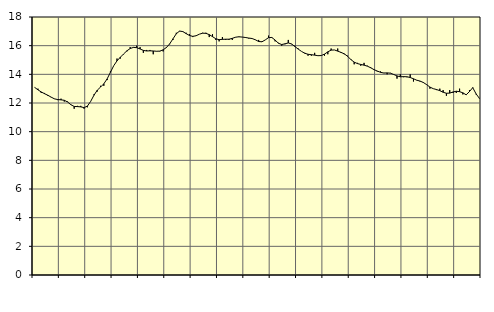
| Category | Piggar | Series 1 |
|---|---|---|
| nan | 13.1 | 13.09 |
| 87.0 | 13 | 12.92 |
| 87.0 | 12.7 | 12.77 |
| 87.0 | 12.7 | 12.65 |
| nan | 12.5 | 12.54 |
| 88.0 | 12.4 | 12.41 |
| 88.0 | 12.3 | 12.29 |
| 88.0 | 12.2 | 12.24 |
| nan | 12.3 | 12.22 |
| 89.0 | 12.1 | 12.19 |
| 89.0 | 12.1 | 12.07 |
| 89.0 | 11.9 | 11.88 |
| nan | 11.6 | 11.76 |
| 90.0 | 11.8 | 11.75 |
| 90.0 | 11.8 | 11.73 |
| 90.0 | 11.6 | 11.68 |
| nan | 11.7 | 11.78 |
| 91.0 | 12.1 | 12.11 |
| 91.0 | 12.6 | 12.54 |
| 91.0 | 12.8 | 12.89 |
| nan | 13.2 | 13.11 |
| 92.0 | 13.2 | 13.34 |
| 92.0 | 13.6 | 13.68 |
| 92.0 | 14.2 | 14.14 |
| nan | 14.6 | 14.6 |
| 93.0 | 15.1 | 14.94 |
| 93.0 | 15.1 | 15.19 |
| 93.0 | 15.4 | 15.42 |
| nan | 15.6 | 15.64 |
| 94.0 | 15.9 | 15.8 |
| 94.0 | 15.9 | 15.88 |
| 94.0 | 16 | 15.86 |
| nan | 15.9 | 15.77 |
| 95.0 | 15.5 | 15.67 |
| 95.0 | 15.7 | 15.63 |
| 95.0 | 15.7 | 15.64 |
| nan | 15.4 | 15.63 |
| 96.0 | 15.6 | 15.61 |
| 96.0 | 15.6 | 15.62 |
| 96.0 | 15.6 | 15.71 |
| nan | 15.9 | 15.87 |
| 97.0 | 16.1 | 16.13 |
| 97.0 | 16.4 | 16.48 |
| 97.0 | 16.9 | 16.83 |
| nan | 17 | 17.02 |
| 98.0 | 17 | 16.98 |
| 98.0 | 16.9 | 16.84 |
| 98.0 | 16.8 | 16.71 |
| nan | 16.6 | 16.65 |
| 99.0 | 16.7 | 16.69 |
| 99.0 | 16.8 | 16.8 |
| 99.0 | 16.9 | 16.87 |
| nan | 16.9 | 16.86 |
| 0.0 | 16.6 | 16.77 |
| 0.0 | 16.8 | 16.63 |
| 0.0 | 16.4 | 16.48 |
| nan | 16.3 | 16.42 |
| 1.0 | 16.6 | 16.44 |
| 1.0 | 16.4 | 16.45 |
| 1.0 | 16.4 | 16.45 |
| nan | 16.4 | 16.51 |
| 2.0 | 16.6 | 16.59 |
| 2.0 | 16.6 | 16.62 |
| 2.0 | 16.6 | 16.6 |
| nan | 16.6 | 16.57 |
| 3.0 | 16.5 | 16.53 |
| 3.0 | 16.5 | 16.5 |
| 3.0 | 16.4 | 16.41 |
| nan | 16.4 | 16.29 |
| 4.0 | 16.3 | 16.27 |
| 4.0 | 16.4 | 16.4 |
| 4.0 | 16.7 | 16.56 |
| nan | 16.6 | 16.57 |
| 5.0 | 16.3 | 16.39 |
| 5.0 | 16.2 | 16.17 |
| 5.0 | 16 | 16.08 |
| nan | 16.1 | 16.13 |
| 6.0 | 16.4 | 16.19 |
| 6.0 | 16.1 | 16.12 |
| 6.0 | 16 | 15.94 |
| nan | 15.8 | 15.76 |
| 7.0 | 15.6 | 15.6 |
| 7.0 | 15.5 | 15.47 |
| 7.0 | 15.3 | 15.4 |
| nan | 15.3 | 15.37 |
| 8.0 | 15.5 | 15.34 |
| 8.0 | 15.3 | 15.3 |
| 8.0 | 15.3 | 15.31 |
| nan | 15.3 | 15.41 |
| 9.0 | 15.4 | 15.57 |
| 9.0 | 15.8 | 15.69 |
| 9.0 | 15.7 | 15.7 |
| nan | 15.8 | 15.62 |
| 10.0 | 15.5 | 15.53 |
| 10.0 | 15.4 | 15.43 |
| 10.0 | 15.3 | 15.26 |
| nan | 15 | 15.03 |
| 11.0 | 14.7 | 14.85 |
| 11.0 | 14.8 | 14.75 |
| 11.0 | 14.6 | 14.69 |
| nan | 14.8 | 14.64 |
| 12.0 | 14.6 | 14.57 |
| 12.0 | 14.5 | 14.46 |
| 12.0 | 14.3 | 14.33 |
| nan | 14.2 | 14.23 |
| 13.0 | 14.2 | 14.14 |
| 13.0 | 14.1 | 14.09 |
| 13.0 | 14 | 14.1 |
| nan | 14.1 | 14.08 |
| 14.0 | 14 | 13.99 |
| 14.0 | 13.7 | 13.89 |
| 14.0 | 14 | 13.83 |
| nan | 13.8 | 13.84 |
| 15.0 | 13.8 | 13.83 |
| 15.0 | 14 | 13.78 |
| 15.0 | 13.5 | 13.69 |
| nan | 13.6 | 13.59 |
| 16.0 | 13.5 | 13.53 |
| 16.0 | 13.4 | 13.43 |
| 16.0 | 13.3 | 13.28 |
| nan | 13 | 13.11 |
| 17.0 | 13 | 13 |
| 17.0 | 12.9 | 12.94 |
| 17.0 | 13 | 12.86 |
| nan | 12.9 | 12.75 |
| 18.0 | 12.5 | 12.68 |
| 18.0 | 12.9 | 12.69 |
| 18.0 | 12.7 | 12.77 |
| nan | 12.7 | 12.82 |
| 19.0 | 13 | 12.79 |
| 19.0 | 12.6 | 12.71 |
| 19.0 | 12.6 | 12.57 |
| nan | 12.9 | 12.8 |
| 20.0 | 13.1 | 13.07 |
| 20.0 | 12.6 | 12.64 |
| 20.0 | 12.3 | 12.33 |